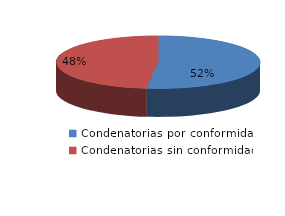
| Category | Series 0 |
|---|---|
| 0 | 74 |
| 1 | 69 |